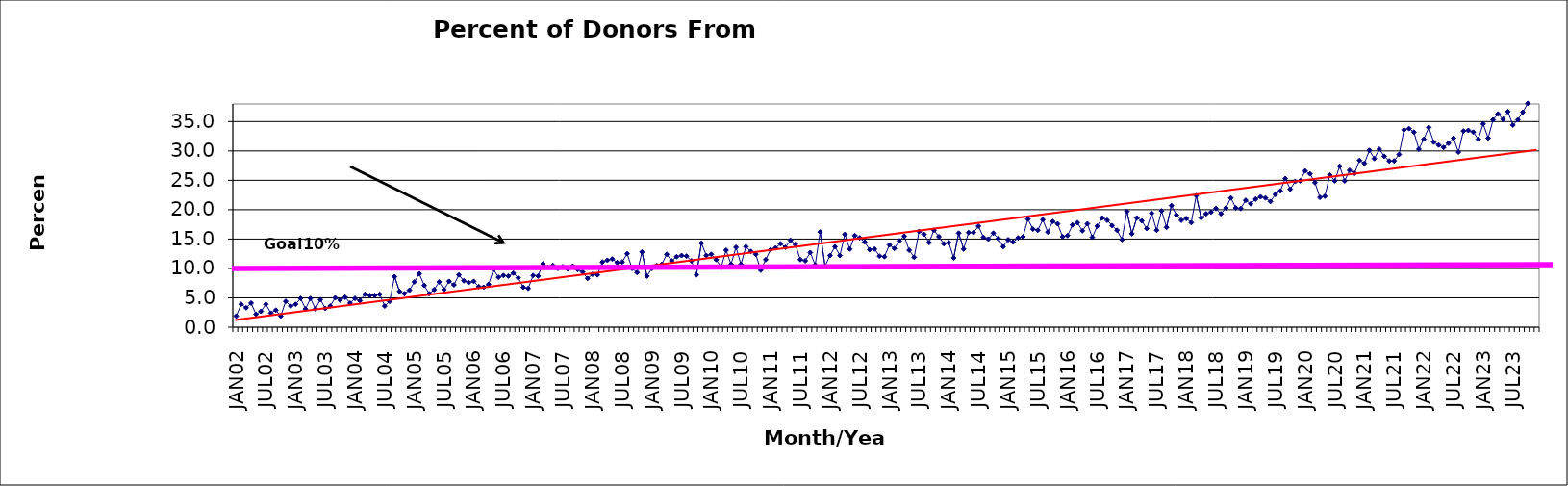
| Category | Series 0 |
|---|---|
| JAN02 | 1.9 |
| FEB02 | 3.9 |
| MAR02 | 3.3 |
| APR02 | 4.1 |
| MAY02 | 2.2 |
| JUN02 | 2.7 |
| JUL02 | 3.9 |
| AUG02 | 2.4 |
| SEP02 | 2.9 |
| OCT02 | 1.9 |
| NOV02 | 4.4 |
| DEC02 | 3.6 |
| JAN03 | 3.9 |
| FEB03 | 4.9 |
| MAR03 | 3.1 |
| APR03 | 4.9 |
| MAY03 | 3.1 |
| JUN03 | 4.7 |
| JUL03 | 3.2 |
| AUG03 | 3.6 |
| SEP03 | 5 |
| OCT03 | 4.6 |
| NOV03 | 5.1 |
| DEC03 | 4.1 |
| JAN04 | 4.9 |
| FEB04 | 4.5 |
| MAR04 | 5.6 |
| APR04 | 5.4 |
| MAY04 | 5.4 |
| JUN04 | 5.6 |
| JUL04 | 3.6 |
| AUG04 | 4.4 |
| SEP04 | 8.6 |
| OCT04 | 6.1 |
| NOV04 | 5.7 |
| DEC04 | 6.3 |
| JAN05 | 7.7 |
| FEB05 | 9.1 |
| MAR05 | 7.1 |
| APR05 | 5.7 |
| MAY05 | 6.4 |
| JUN05 | 7.7 |
| JUL05 | 6.4 |
| AUG05 | 7.8 |
| SEP05 | 7.2 |
| OCT05 | 8.9 |
| NOV05 | 7.9 |
| DEC05 | 7.6 |
| JAN06 | 7.8 |
| FEB06 | 6.9 |
| MAR06 | 6.8 |
| APR06 | 7.3 |
| MAY06 | 9.8 |
| JUN06 | 8.5 |
| JUL06 | 8.8 |
| AUG06 | 8.7 |
| SEP06 | 9.2 |
| OCT06 | 8.4 |
| NOV06 | 6.8 |
| DEC06 | 6.6 |
| JAN07 | 8.8 |
| FEB07 | 8.7 |
| MAR07 | 10.8 |
| APR07 | 10.2 |
| MAY07 | 10.5 |
| JUN07 | 10 |
| JUL07 | 10.3 |
| AUG07 | 9.9 |
| SEP07 | 10.4 |
| OCT07 | 9.8 |
| NOV07 | 9.4 |
| DEC07 | 8.3 |
| JAN08 | 9 |
| FEB08 | 8.9 |
| MAR08 | 11.1 |
| APR08 | 11.4 |
| MAY08 | 11.6 |
| JUN08 | 11 |
| JUL08 | 11.1 |
| AUG08 | 12.5 |
| SEP08 | 10 |
| OCT08 | 9.3 |
| NOV08 | 12.8 |
| DEC08 | 8.7 |
| JAN09 | 10 |
| FEB09 | 10.5 |
| MAR09 | 10.7 |
| APR09 | 12.4 |
| MAY09 | 11.3 |
| JUN09 | 12 |
| JUL09 | 12.2 |
| AUG09 | 12.1 |
| SEP09 | 11.3 |
| OCT09 | 8.9 |
| NOV09 | 14.3 |
| DEC09 | 12.2 |
| JAN10 | 12.4 |
| FEB10 | 11.5 |
| MAR10 | 10.2 |
| APR10 | 13.1 |
| MAY10 | 10.7 |
| JUN10 | 13.6 |
| JUL10 | 10.7 |
| AUG10 | 13.7 |
| SEP10 | 12.9 |
| OCT10 | 12.4 |
| NOV10 | 9.7 |
| DEC10 | 11.5 |
| JAN11 | 13.2 |
| FEB11 | 13.5 |
| MAR11 | 14.2 |
| APR11 | 13.6 |
| MAY11 | 14.8 |
| JUN11 | 14.1 |
| JUL11 | 11.5 |
| AUG11 | 11.3 |
| SEP11 | 12.7 |
| OCT11 | 10.6 |
| NOV11 | 16.2 |
| DEC11 | 10.4 |
| JAN12 | 12.2 |
| FEB12 | 13.7 |
| MAR12 | 12.2 |
| APR12 | 15.8 |
| MAY12 | 13.3 |
| JUN12 | 15.6 |
| JUL12 | 15.2 |
| AUG12 | 14.5 |
| SEP12 | 13.2 |
| OCT12 | 13.3 |
| NOV12 | 12.1 |
| DEC12 | 12 |
| JAN13 | 14 |
| FEB13 | 13.4 |
| MAR13 | 14.7 |
| APR13 | 15.5 |
| MAY13 | 13.1 |
| JUN13 | 11.9 |
| JUL13 | 16.3 |
| AUG13 | 15.8 |
| SEP13 | 14.4 |
| OCT13 | 16.5 |
| NOV13 | 15.4 |
| DEC13 | 14.2 |
| JAN14 | 14.4 |
| FEB14 | 11.8 |
| MAR14 | 16 |
| APR14 | 13.3 |
| MAY14 | 16.1 |
| JUN14 | 16.1 |
| JUL14 | 17.2 |
| AUG14 | 15.3 |
| SEP14 | 15 |
| OCT14 | 16 |
| NOV14 | 15.1 |
| DEC14 | 13.7 |
| JAN15 | 14.9 |
| FEB15 | 14.5 |
| MAR15 | 15.2 |
| APR15 | 15.4 |
| MAY15 | 18.4 |
| JUN15 | 16.7 |
| JUL15 | 16.5 |
| AUG15 | 18.3 |
| SEP15 | 16.2 |
| OCT15 | 18 |
| NOV15 | 17.6 |
| DEC15 | 15.4 |
| JAN16 | 15.6 |
| FEB16 | 17.4 |
| MAR16 | 17.8 |
| APR16 | 16.4 |
| MAY16 | 17.6 |
| JUN16 | 15.3 |
| JUL16 | 17.2 |
| AUG16 | 18.6 |
| SEP16 | 18.2 |
| OCT16 | 17.3 |
| NOV16 | 16.5 |
| DEC16 | 14.9 |
| JAN17 | 19.7 |
| FEB17 | 15.9 |
| MAR17 | 18.6 |
| APR17 | 18.1 |
| MAY17 | 16.8 |
| JUN17 | 19.4 |
| JUL17 | 16.5 |
| AUG17 | 19.8 |
| SEP17 | 17 |
| OCT17 | 20.7 |
| NOV17 | 19.1 |
| DEC17 | 18.2 |
| JAN18 | 18.5 |
| FEB18 | 17.8 |
| MAR18 | 22.4 |
| APR18 | 18.6 |
| MAY18 | 19.3 |
| JUN18 | 19.6 |
| JUL18 | 20.2 |
| AUG18 | 19.3 |
| SEP18 | 20.3 |
| OCT18 | 22 |
| NOV18 | 20.3 |
| DEC18 | 20.2 |
| JAN19 | 21.6 |
| FEB19 | 21 |
| MAR19 | 21.8 |
| APR19 | 22.2 |
| MAY19 | 22 |
| JUN19 | 21.4 |
| JUL19 | 22.6 |
| AUG19 | 23.2 |
| SEP19 | 25.3 |
| OCT19 | 23.5 |
| NOV19 | 24.8 |
| DEC19 | 24.9 |
| JAN20 | 26.6 |
| FEB20 | 26.1 |
| MAR20 | 24.6 |
| APR20 | 22.1 |
| MAY20 | 22.3 |
| JUN20 | 25.9 |
| JUL20 | 24.9 |
| AUG20 | 27.4 |
| SEP20 | 24.9 |
| OCT20 | 26.7 |
| NOV20 | 26.2 |
| DEC20 | 28.4 |
| JAN21 | 27.9 |
| FEB21 | 30.1 |
| MAR21 | 28.7 |
| APR21 | 30.3 |
| MAY21 | 29.1 |
| JUN21 | 28.3 |
| JUL21 | 28.3 |
| AUG21 | 29.4 |
| SEP21 | 33.6 |
| OCT21 | 33.8 |
| NOV21 | 33.2 |
| DEC21 | 30.3 |
| JAN22 | 32 |
| FEB22 | 34 |
| MAR22 | 31.5 |
| APR22 | 31 |
| MAY22 | 30.6 |
| JUN22 | 31.3 |
| JUL22 | 32.2 |
| AUG22 | 29.8 |
| SEP22 | 33.4 |
| OCT22 | 33.5 |
| NOV22 | 33.2 |
| DEC22 | 32 |
| JAN23 | 34.6 |
| FEB23 | 32.2 |
| MAR23 | 35.3 |
| APR23 | 36.3 |
| MAY23 | 35.4 |
| JUN23 | 36.7 |
| JUL23 | 34.4 |
| AUG23 | 35.3 |
| SEP23 | 36.6 |
| OCT23 | 38.1 |
| NOV23 | 38.9 |